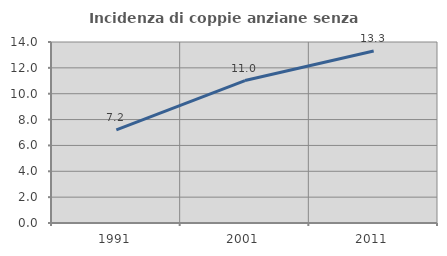
| Category | Incidenza di coppie anziane senza figli  |
|---|---|
| 1991.0 | 7.195 |
| 2001.0 | 11.017 |
| 2011.0 | 13.298 |